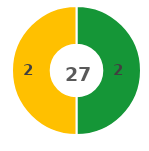
| Category | Series 0 |
|---|---|
| 0 | 2 |
| 1 | 0 |
| 2 | 2 |
| 3 | 0 |
| 4 | 0 |